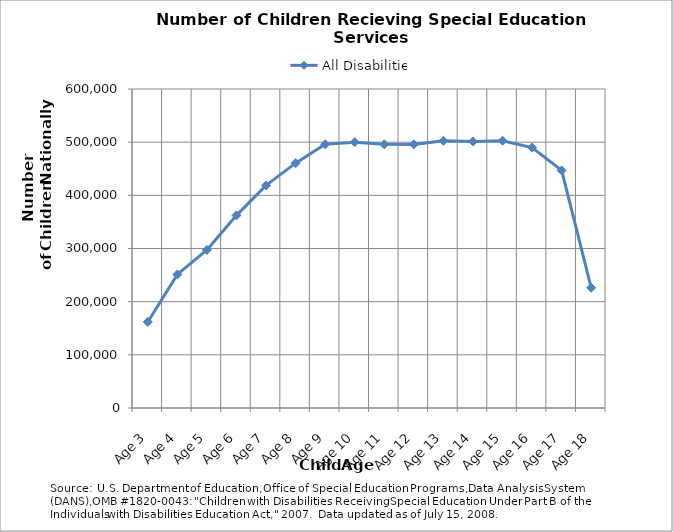
| Category | All Disabilities |
|---|---|
| Age 3 | 161885 |
| Age 4 | 251177 |
| Age 5 | 297309 |
| Age 6 | 362388 |
| Age 7 | 418651 |
| Age 8 | 460502 |
| Age 9 | 496040 |
| Age 10 | 500047 |
| Age 11 | 495988 |
| Age 12 | 495821 |
| Age 13 | 502480 |
| Age 14 | 501363 |
| Age 15 | 502607 |
| Age 16 | 489757 |
| Age 17 | 446877 |
| Age 18 | 226146 |